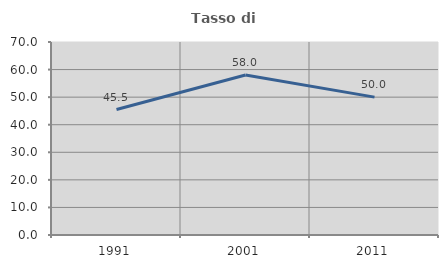
| Category | Tasso di occupazione   |
|---|---|
| 1991.0 | 45.506 |
| 2001.0 | 58.011 |
| 2011.0 | 50 |